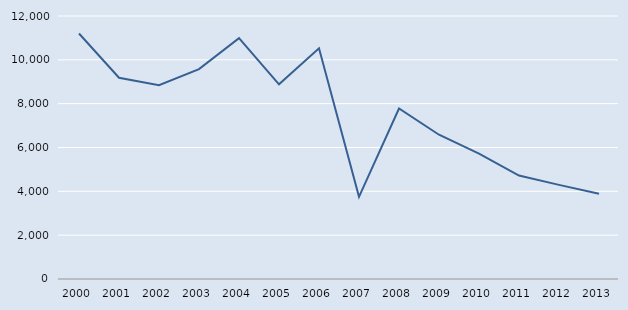
| Category | Series 0 |
|---|---|
| 2000.0 | 11201 |
| 2001.0 | 9182 |
| 2002.0 | 8844 |
| 2003.0 | 9577 |
| 2004.0 | 10988 |
| 2005.0 | 8884 |
| 2006.0 | 10524 |
| 2007.0 | 3749 |
| 2008.0 | 7778 |
| 2009.0 | 6583 |
| 2010.0 | 5723 |
| 2011.0 | 4720 |
| 2012.0 | 4294 |
| 2013.0 | 3887 |